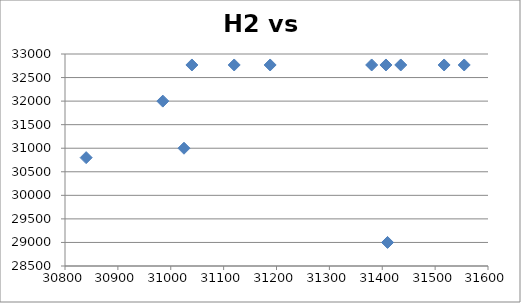
| Category | Series 0 |
|---|---|
| 31120.0 | 32767 |
| 30840.0 | 30800 |
| 31040.0 | 32767 |
| 31188.0 | 32767 |
| 31517.0 | 32767 |
| 31555.0 | 32767 |
| 31380.0 | 32767 |
| 31435.0 | 32767 |
| 30985.0 | 32000 |
| 31407.0 | 32767 |
| 31410.0 | 29000 |
| 31025.0 | 31000 |